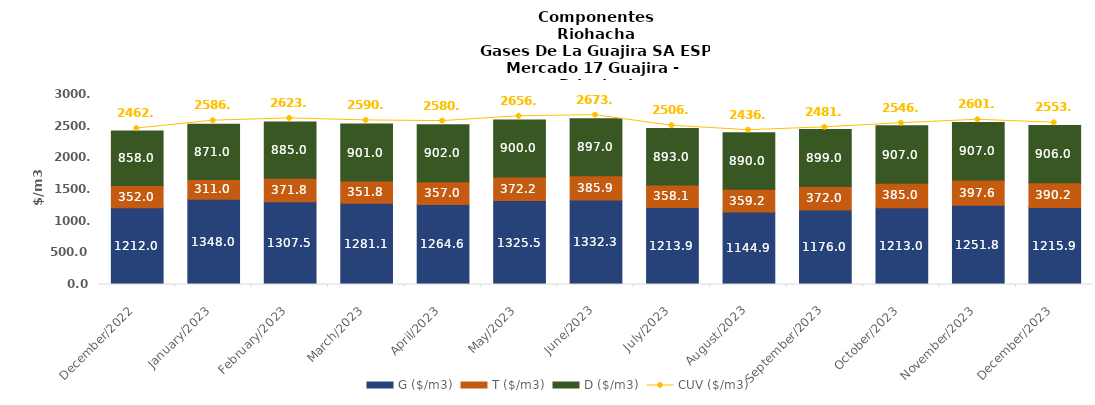
| Category | G ($/m3) | T ($/m3) | D ($/m3) |
|---|---|---|---|
| 2022-12-01 | 1212 | 352 | 858 |
| 2023-01-01 | 1348 | 310.95 | 871 |
| 2023-02-01 | 1307.53 | 371.84 | 885 |
| 2023-03-01 | 1281.1 | 351.77 | 901 |
| 2023-04-01 | 1264.63 | 356.99 | 902 |
| 2023-05-01 | 1325.54 | 372.19 | 900 |
| 2023-06-01 | 1332.29 | 385.86 | 897 |
| 2023-07-01 | 1213.88 | 358.06 | 893 |
| 2023-08-01 | 1144.92 | 359.17 | 890 |
| 2023-09-01 | 1176 | 372 | 899 |
| 2023-10-01 | 1213 | 385 | 907 |
| 2023-11-01 | 1251.77 | 397.64 | 907 |
| 2023-12-01 | 1215.86 | 390.2 | 906 |